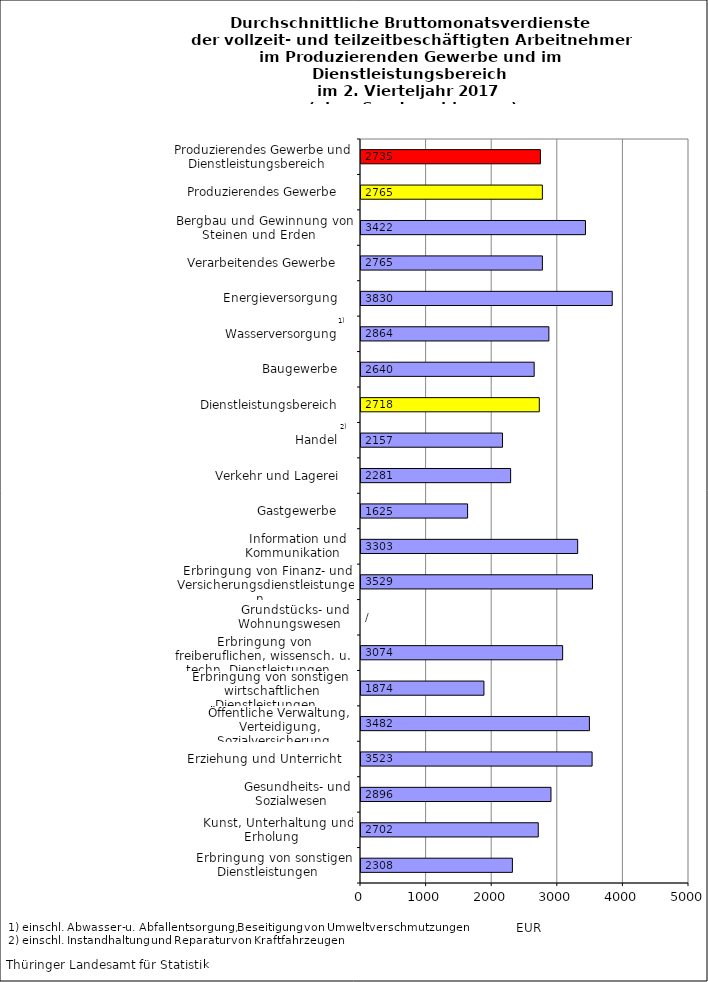
| Category | Series 0 |
|---|---|
| Erbringung von sonstigen Dienstleistungen    | 2308 |
| Kunst, Unterhaltung und Erholung    | 2702 |
| Gesundheits- und Sozialwesen    | 2896 |
| Erziehung und Unterricht    | 3523 |
| Öffentliche Verwaltung, Verteidigung, Sozialversicherung    | 3482 |
| Erbringung von sonstigen  wirtschaftlichen Dienstleistungen    | 1874 |
| Erbringung von freiberuflichen, wissensch. u. techn. Dienstleistungen    | 3074 |
| Grundstücks- und Wohnungswesen    | 0 |
| Erbringung von Finanz- und Versicherungsdienstleistungen    | 3529 |
| Information und Kommunikation    | 3303 |
| Gastgewerbe    | 1625 |
| Verkehr und Lagerei    | 2281 |
| Handel    | 2157 |
| Dienstleistungsbereich    | 2718 |
| Baugewerbe    | 2640 |
| Wasserversorgung    | 2864 |
| Energieversorgung    | 3830 |
| Verarbeitendes Gewerbe    | 2765 |
| Bergbau und Gewinnung von Steinen und Erden    | 3422 |
| Produzierendes Gewerbe    | 2765 |
| Produzierendes Gewerbe und Dienstleistungsbereich    | 2735 |